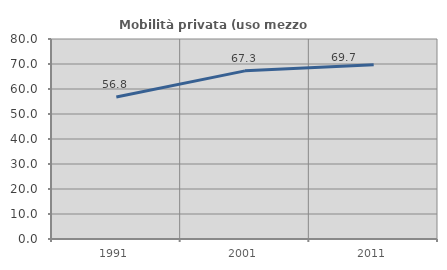
| Category | Mobilità privata (uso mezzo privato) |
|---|---|
| 1991.0 | 56.834 |
| 2001.0 | 67.254 |
| 2011.0 | 69.695 |